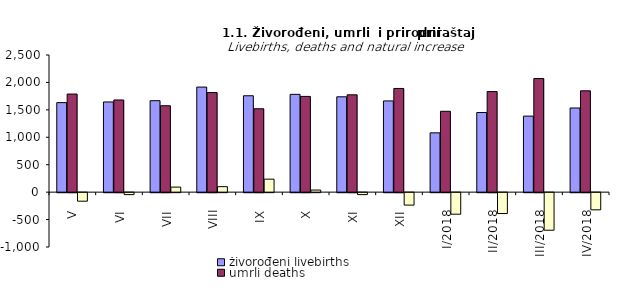
| Category | živorođeni livebirths | umrli deaths | prirodni priraštaj natural increase |
|---|---|---|---|
| V | 1632 | 1788 | -156 |
| VI | 1644 | 1680 | -36 |
| VII | 1667 | 1575 | 92 |
| VIII | 1915 | 1815 | 100 |
| IX | 1757 | 1520 | 237 |
| X | 1783 | 1745 | 38 |
| XI | 1738 | 1774 | -36 |
| XII | 1663 | 1890 | -227 |
| I/2018 | 1081 | 1474 | -393 |
| II/2018 | 1452 | 1833 | -381 |
| III/2018 | 1386 | 2071 | -685 |
| IV/2018 | 1534 | 1847 | -313 |